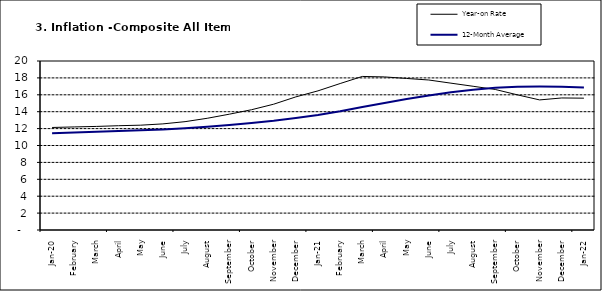
| Category | Year-on Rate | 12-Month Average |
|---|---|---|
| Jan-20 | 12.132 | 11.462 |
| February | 12.199 | 11.539 |
| March | 12.257 | 11.624 |
| April | 12.341 | 11.706 |
| May | 12.404 | 11.791 |
| June | 12.559 | 11.904 |
| July | 12.821 | 12.049 |
| August | 13.22 | 12.233 |
| September | 13.707 | 12.44 |
| October | 14.233 | 12.664 |
| November | 14.887 | 12.923 |
| December | 15.753 | 13.246 |
| Jan-21 | 16.466 | 13.616 |
| February | 17.335 | 14.053 |
| March | 18.171 | 14.554 |
| April | 18.117 | 15.039 |
| May | 17.933 | 15.499 |
| June | 17.751 | 15.927 |
| July | 17.377 | 16.298 |
| August | 17.009 | 16.601 |
| September | 16.63 | 16.83 |
| October | 15.994 | 16.958 |
| November | 15.396 | 16.979 |
| December | 15.625 | 16.953 |
| Jan-22 | 15.601 | 16.869 |